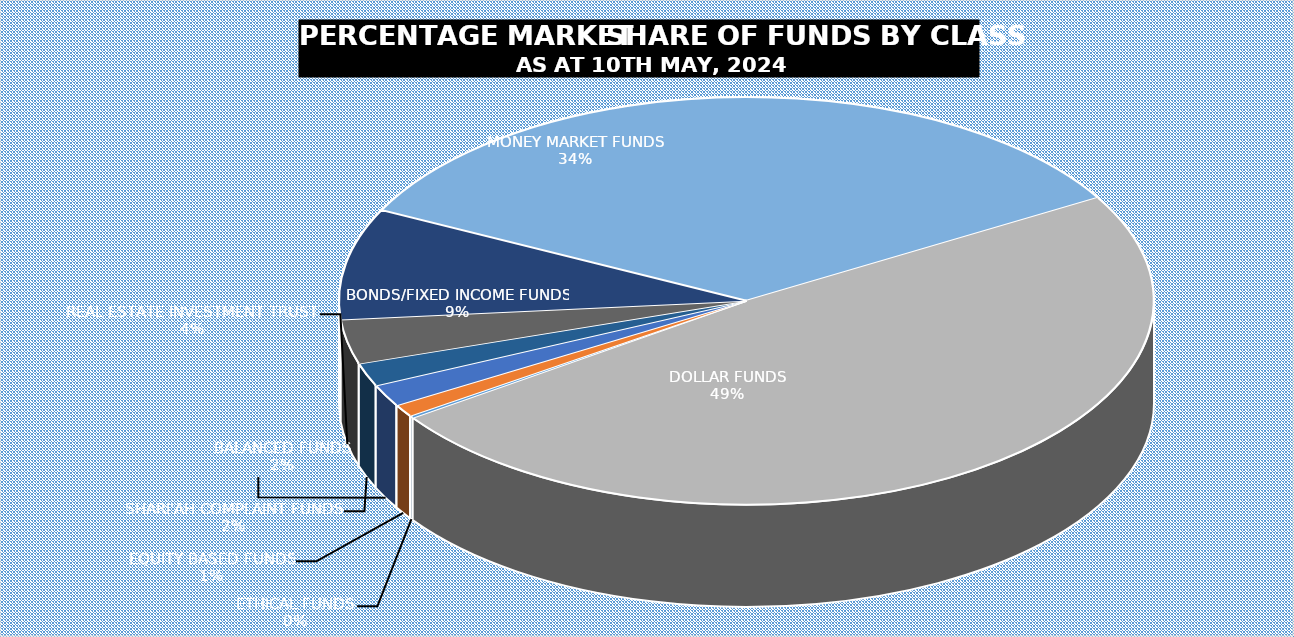
| Category | 10-May |
|---|---|
| ETHICAL FUNDS | 4887347689.74 |
| EQUITY BASED FUNDS | 27676372012.244 |
| BALANCED FUNDS | 49028772091.292 |
| SHARI'AH COMPLAINT FUNDS | 51244098077.137 |
| REAL ESTATE INVESTMENT TRUST | 99061132410.27 |
| BONDS/FIXED INCOME FUNDS | 246839006741.438 |
| MONEY MARKET FUNDS | 959754142868.046 |
| DOLLAR FUNDS | 1366888956827.947 |